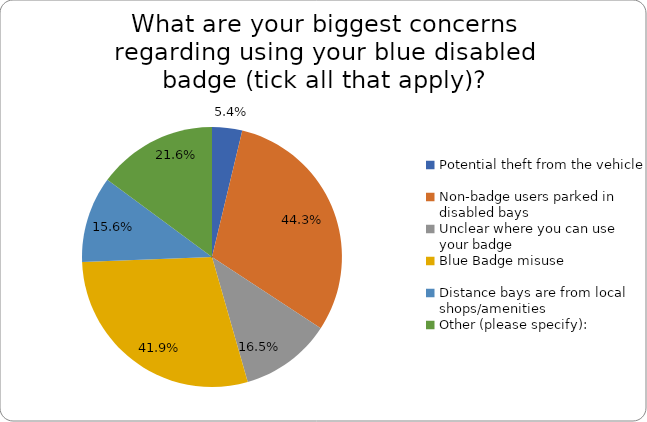
| Category | Series 0 |
|---|---|
| Potential theft from the vehicle | 0.054 |
| Non-badge users parked in disabled bays | 0.443 |
| Unclear where you can use your badge | 0.165 |
| Blue Badge misuse | 0.419 |
| Distance bays are from local shops/amenities | 0.156 |
| Other (please specify): | 0.216 |